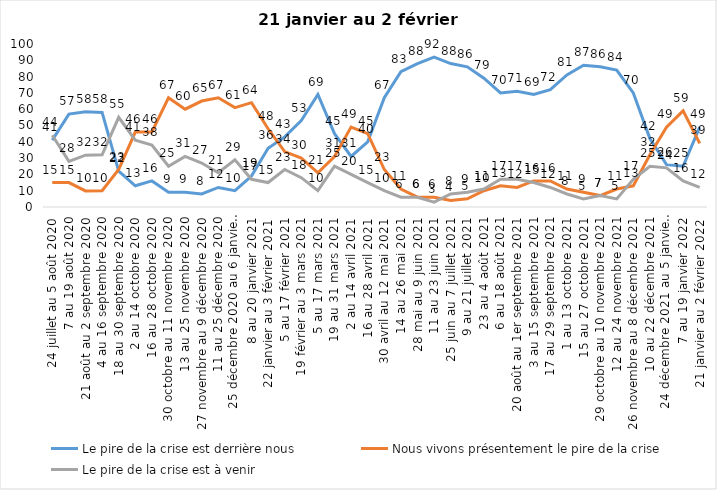
| Category | Le pire de la crise est derrière nous | Nous vivons présentement le pire de la crise | Le pire de la crise est à venir |
|---|---|---|---|
| 24 juillet au 5 août 2020 | 41 | 15 | 44 |
| 7 au 19 août 2020 | 57 | 15 | 28 |
| 21 août au 2 septembre 2020 | 58.39 | 9.84 | 31.77 |
| 4 au 16 septembre 2020 | 58 | 10 | 32 |
| 18 au 30 septembre 2020 | 22 | 23 | 55 |
| 2 au 14 octobre 2020 | 13 | 46 | 41 |
| 16 au 28 octobre 2020 | 16 | 46 | 38 |
| 30 octobre au 11 novembre 2020 | 9 | 67 | 25 |
| 13 au 25 novembre 2020 | 9 | 60 | 31 |
| 27 novembre au 9 décembre 2020 | 8 | 65 | 27 |
| 11 au 25 décembre 2020 | 12 | 67 | 21 |
| 25 décembre 2020 au 6 janvier 2021 | 10 | 61 | 29 |
| 8 au 20 janvier 2021 | 19 | 64 | 17 |
| 22 janvier au 3 février 2021 | 36 | 48 | 15 |
| 5 au 17 février 2021 | 43 | 34 | 23 |
| 19 février au 3 mars 2021 | 53 | 30 | 18 |
| 5 au 17 mars 2021 | 69 | 21 | 10 |
| 19 au 31 mars 2021 | 45 | 31 | 25 |
| 2 au 14 avril 2021 | 31 | 49 | 20 |
| 16 au 28 avril 2021 | 40 | 45 | 15 |
| 30 avril au 12 mai 2021 | 67 | 23 | 10 |
| 14 au 26 mai 2021 | 83 | 11 | 6 |
| 28 mai au 9 juin 2021 | 88 | 6 | 6 |
| 11 au 23 juin 2021 | 92 | 6 | 3 |
| 25 juin au 7 juillet 2021 | 88 | 4 | 8 |
| 9 au 21 juillet 2021 | 86 | 5 | 9 |
| 23 au 4 août 2021 | 79 | 10 | 11 |
| 6 au 18 août 2021 | 70 | 13 | 17 |
| 20 août au 1er septembre 2021 | 71 | 12 | 17 |
| 3 au 15 septembre 2021 | 69 | 16 | 15 |
| 17 au 29 septembre 2021 | 72 | 16 | 12 |
| 1 au 13 octobre 2021 | 81 | 11 | 8 |
| 15 au 27 octobre 2021 | 87 | 9 | 5 |
| 29 octobre au 10 novembre 2021 | 86 | 7 | 7 |
| 12 au 24 novembre 2021 | 84 | 11 | 5 |
| 26 novembre au 8 décembre 2021 | 70 | 13 | 17 |
| 10 au 22 décembre 2021 | 42 | 32 | 25 |
| 24 décembre 2021 au 5 janvier 2022 | 26 | 49 | 24 |
| 7 au 19 janvier 2022 | 25 | 59 | 16 |
| 21 janvier au 2 février 2022 | 49 | 39 | 12 |